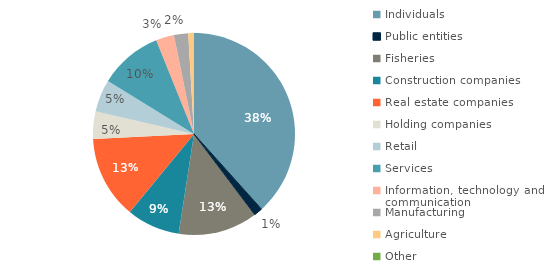
| Category | Series 0 |
|---|---|
| Individuals | 347447 |
| Public entities | 12404 |
| Fisheries | 115163 |
| Construction companies  | 77203 |
| Real estate companies | 120242 |
| Holding companies | 39908 |
| Retail | 46549 |
| Services | 91660 |
| Information, technology and communication | 26391 |
| Manufacturing | 20713 |
| Agriculture | 8230 |
| Other | 17 |